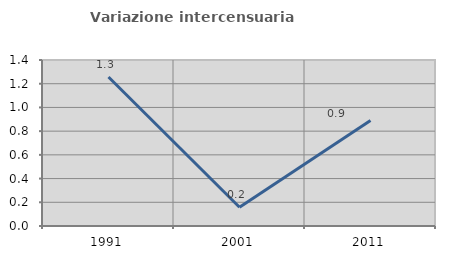
| Category | Variazione intercensuaria annua |
|---|---|
| 1991.0 | 1.256 |
| 2001.0 | 0.158 |
| 2011.0 | 0.89 |